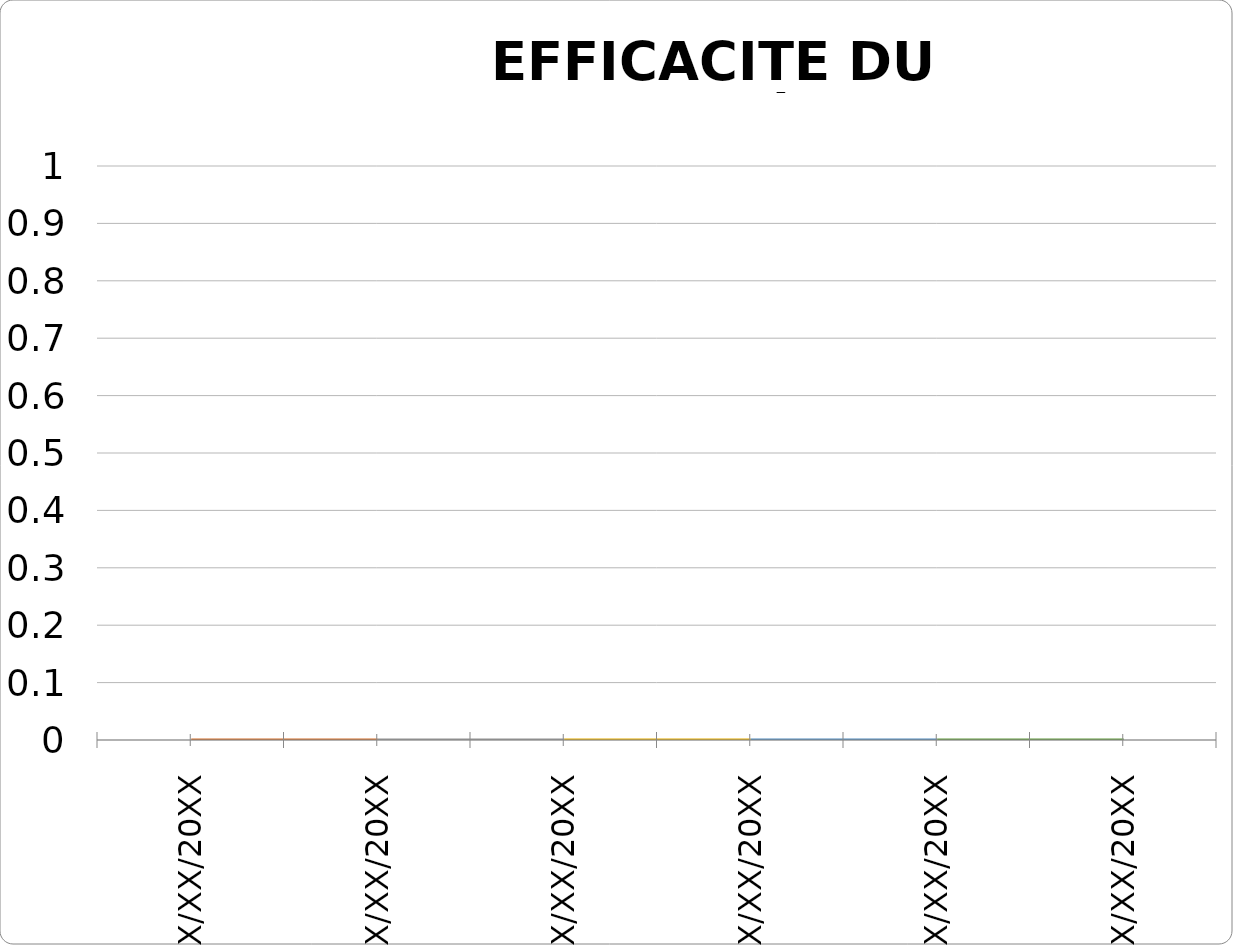
| Category | Nombre de défauts |
|---|---|
| XX/XX/20XX | 0 |
| XX/XX/20XX | 0 |
| XX/XX/20XX | 0 |
| XX/XX/20XX | 0 |
| XX/XX/20XX | 0 |
| XX/XX/20XX | 0 |